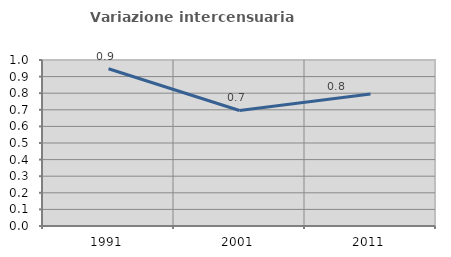
| Category | Variazione intercensuaria annua |
|---|---|
| 1991.0 | 0.947 |
| 2001.0 | 0.696 |
| 2011.0 | 0.796 |